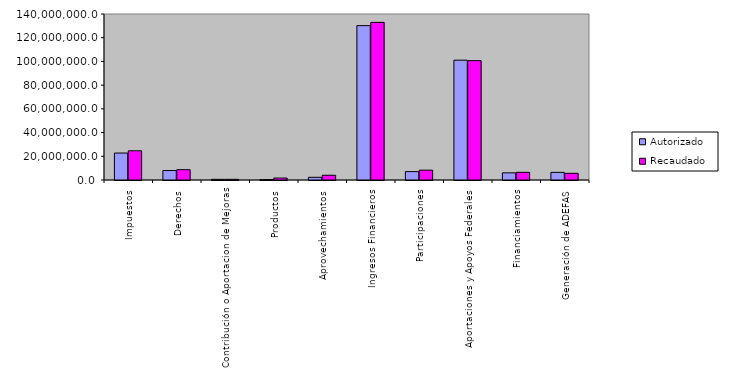
| Category | Autorizado | Recaudado |
|---|---|---|
| 0 | 22726953.1 | 24626301.9 |
| 1 | 7969499.1 | 8686631.4 |
| 2 | 545975.6 | 556506.2 |
| 3 | 328060.1 | 1640820.2 |
| 4 | 2274144.1 | 3993099.5 |
| 5 | 130170741.048 | 132945596.6 |
| 6 | 7075764.579 | 8295267.4 |
| 7 | 101054015.985 | 100654976.3 |
| 8 | 6022275.524 | 6479034 |
| 9 | 6442504.4 | 5619323.7 |